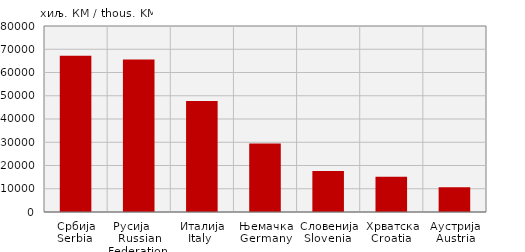
| Category | Увоз
Import |
|---|---|
| Србија
Serbia  | 67220 |
| Русија      Russian Federation  | 65638 |
| Италија
Italy  | 47693 |
| Њемачка
Germany | 29507 |
| Словенија
Slovenia  | 17620 |
| Хрватска
Croatia  | 15193 |
| Аустрија
Austria | 10693 |